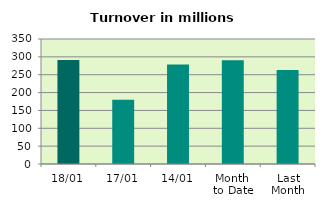
| Category | Series 0 |
|---|---|
| 18/01 | 291.55 |
| 17/01 | 180.008 |
| 14/01 | 278.68 |
| Month 
to Date | 290.465 |
| Last
Month | 263.133 |